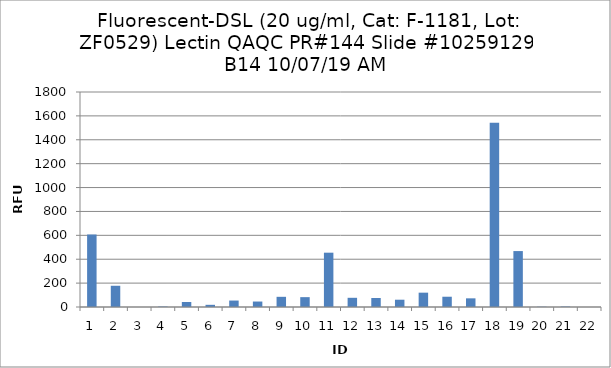
| Category | Series 0 |
|---|---|
| 0 | 607 |
| 1 | 177.75 |
| 2 | -1.75 |
| 3 | 3.75 |
| 4 | 42 |
| 5 | 18.25 |
| 6 | 54 |
| 7 | 45.75 |
| 8 | 85.25 |
| 9 | 82.5 |
| 10 | 454.75 |
| 11 | 77 |
| 12 | 75.5 |
| 13 | 61 |
| 14 | 120 |
| 15 | 86 |
| 16 | 72.5 |
| 17 | 1543 |
| 18 | 468.25 |
| 19 | 2.25 |
| 20 | 3.75 |
| 21 | -1 |